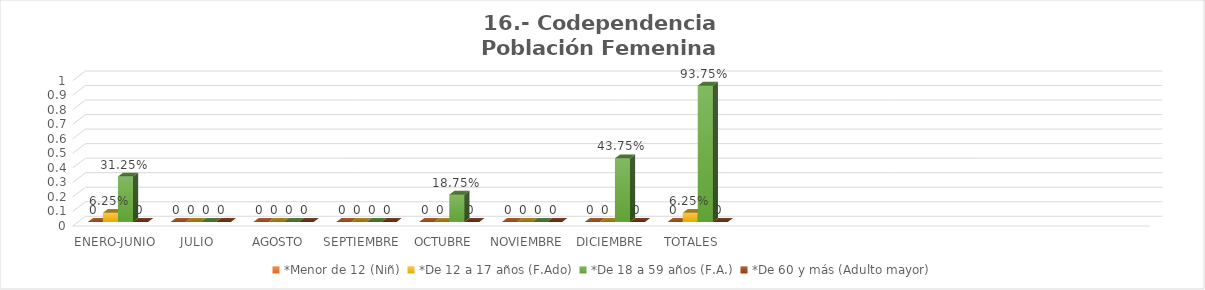
| Category | *Menor de 12 (Niñ) | *De 12 a 17 años (F.Ado) | *De 18 a 59 años (F.A.) | *De 60 y más (Adulto mayor) |
|---|---|---|---|---|
| ENERO-JUNIO | 0 | 0.062 | 0.312 | 0 |
| JULIO | 0 | 0 | 0 | 0 |
| AGOSTO | 0 | 0 | 0 | 0 |
| SEPTIEMBRE | 0 | 0 | 0 | 0 |
| OCTUBRE | 0 | 0 | 0.188 | 0 |
| NOVIEMBRE | 0 | 0 | 0 | 0 |
| DICIEMBRE | 0 | 0 | 0.438 | 0 |
| TOTALES | 0 | 0.062 | 0.938 | 0 |